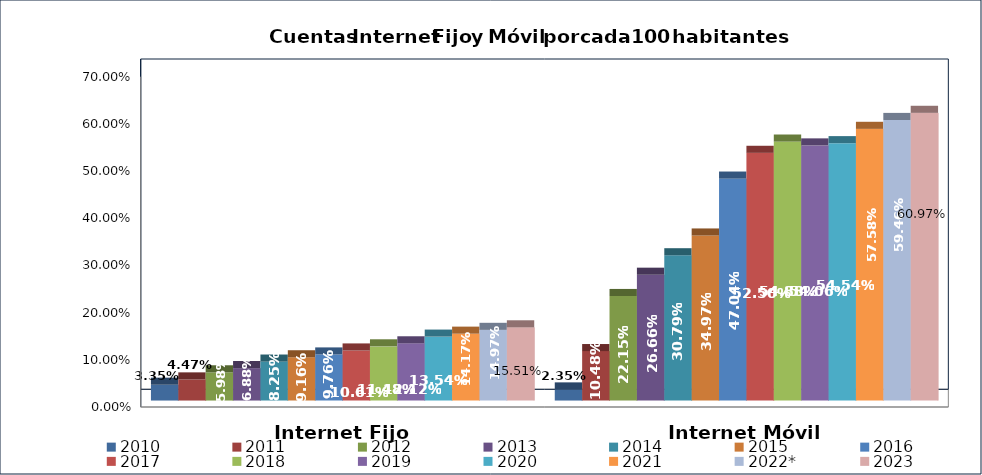
| Category | 2010 | 2011 | 2012 | 2013 | 2014 | 2015 | 2016 | 2017 | 2018 | 2019 | 2020 | 2021 | 2022* | 2023 |
|---|---|---|---|---|---|---|---|---|---|---|---|---|---|---|
| Internet Fijo | 0.033 | 0.045 | 0.06 | 0.069 | 0.083 | 0.092 | 0.098 | 0.106 | 0.115 | 0.121 | 0.135 | 0.142 | 0.15 | 0.155 |
| Internet Móvil | 0.024 | 0.105 | 0.222 | 0.267 | 0.308 | 0.35 | 0.47 | 0.525 | 0.549 | 0.541 | 0.545 | 0.576 | 0.595 | 0.61 |